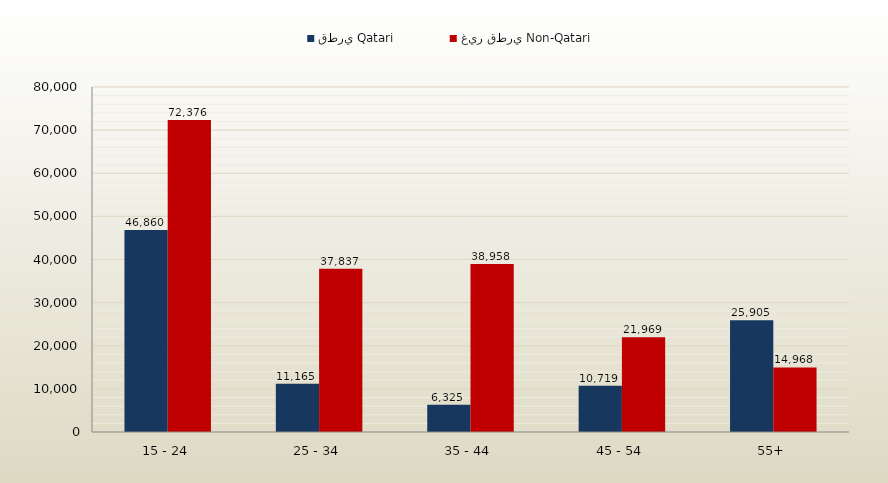
| Category | قطري Qatari | غير قطري Non-Qatari |
|---|---|---|
| 15 - 24 | 46860 | 72376 |
| 25 - 34 | 11165 | 37837 |
| 35 - 44 | 6325 | 38958 |
| 45 - 54 | 10719 | 21969 |
| 55+ | 25905 | 14968 |